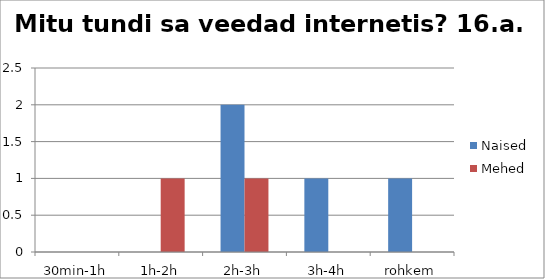
| Category | Naised | Mehed |
|---|---|---|
| 30min-1h | 0 | 0 |
| 1h-2h | 0 | 1 |
| 2h-3h | 2 | 1 |
| 3h-4h | 1 | 0 |
| rohkem | 1 | 0 |